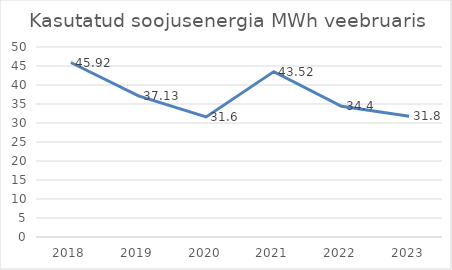
| Category | Series 0 |
|---|---|
| 2018.0 | 45.92 |
| 2019.0 | 37.13 |
| 2020.0 | 31.6 |
| 2021.0 | 43.52 |
| 2022.0 | 34.4 |
| 2023.0 | 31.8 |